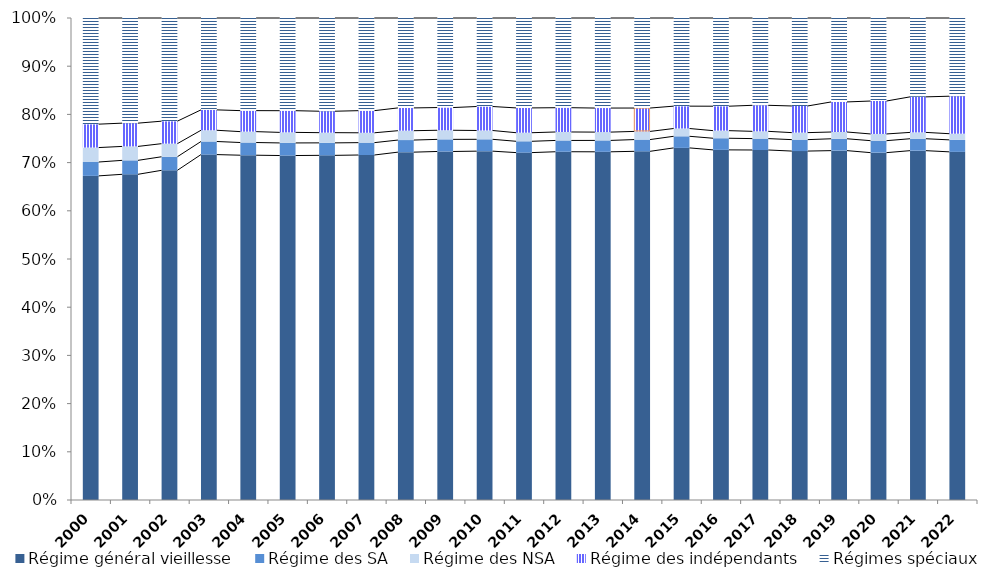
| Category | Régime général vieillesse | Régime des SA | Régime des NSA | Régime des indépendants | Régimes spéciaux |
|---|---|---|---|---|---|
| 2000.0 | 0.672 | 0.029 | 0.03 | 0.049 | 0.22 |
| 2001.0 | 0.676 | 0.029 | 0.029 | 0.048 | 0.218 |
| 2002.0 | 0.684 | 0.028 | 0.027 | 0.047 | 0.214 |
| 2003.0 | 0.717 | 0.027 | 0.023 | 0.042 | 0.191 |
| 2004.0 | 0.715 | 0.026 | 0.023 | 0.044 | 0.192 |
| 2005.0 | 0.715 | 0.026 | 0.022 | 0.045 | 0.192 |
| 2006.0 | 0.715 | 0.026 | 0.021 | 0.044 | 0.193 |
| 2007.0 | 0.716 | 0.026 | 0.02 | 0.046 | 0.192 |
| 2008.0 | 0.722 | 0.025 | 0.019 | 0.047 | 0.187 |
| 2009.0 | 0.723 | 0.025 | 0.019 | 0.047 | 0.186 |
| 2010.0 | 0.724 | 0.025 | 0.018 | 0.05 | 0.184 |
| 2011.0 | 0.721 | 0.023 | 0.018 | 0.051 | 0.187 |
| 2012.0 | 0.723 | 0.023 | 0.018 | 0.05 | 0.186 |
| 2013.0 | 0.722 | 0.024 | 0.017 | 0.05 | 0.187 |
| 2014.0 | 0.723 | 0.024 | 0.017 | 0.049 | 0.187 |
| 2015.0 | 0.73 | 0.024 | 0.016 | 0.046 | 0.183 |
| 2016.0 | 0.726 | 0.024 | 0.016 | 0.051 | 0.183 |
| 2017.0 | 0.726 | 0.024 | 0.015 | 0.054 | 0.181 |
| 2018.0 | 0.724 | 0.024 | 0.015 | 0.055 | 0.183 |
| 2019.0 | 0.725 | 0.025 | 0.014 | 0.062 | 0.174 |
| 2020.0 | 0.721 | 0.025 | 0.014 | 0.068 | 0.172 |
| 2021.0 | 0.725 | 0.025 | 0.013 | 0.074 | 0.164 |
| 2022.0 | 0.722 | 0.025 | 0.013 | 0.078 | 0.162 |